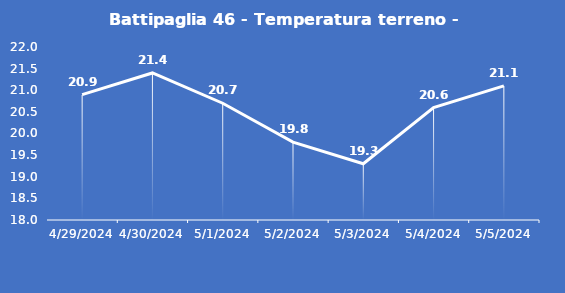
| Category | Battipaglia 46 - Temperatura terreno - Max (°C) |
|---|---|
| 4/29/24 | 20.9 |
| 4/30/24 | 21.4 |
| 5/1/24 | 20.7 |
| 5/2/24 | 19.8 |
| 5/3/24 | 19.3 |
| 5/4/24 | 20.6 |
| 5/5/24 | 21.1 |